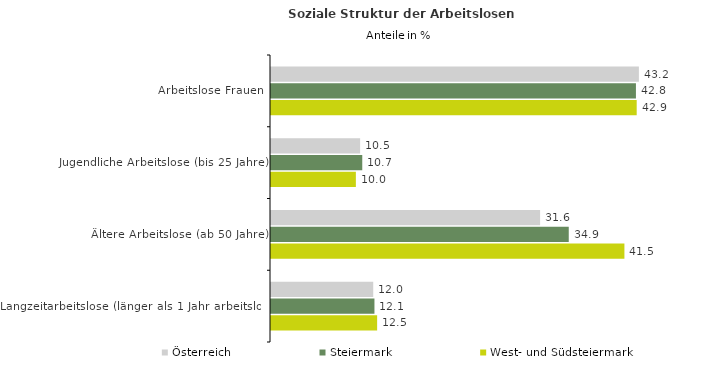
| Category | Österreich | Steiermark | West- und Südsteiermark |
|---|---|---|---|
| Arbeitslose Frauen | 43.18 | 42.833 | 42.922 |
| Jugendliche Arbeitslose (bis 25 Jahre) | 10.46 | 10.711 | 9.961 |
| Ältere Arbeitslose (ab 50 Jahre) | 31.584 | 34.947 | 41.48 |
| Langzeitarbeitslose (länger als 1 Jahr arbeitslos) | 11.999 | 12.142 | 12.457 |